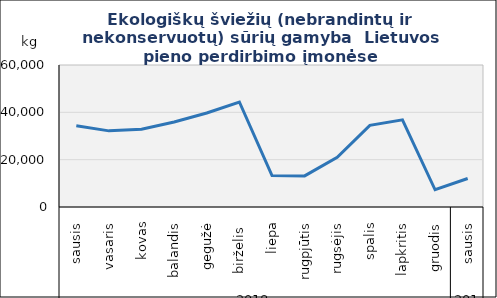
| Category | Švieži (nebrandinti ir nekonservuoti) sūriai |
|---|---|
| 0 | 34289 |
| 1 | 32172 |
| 2 | 32897 |
| 3 | 35895 |
| 4 | 39727 |
| 5 | 44362 |
| 6 | 13297 |
| 7 | 13150 |
| 8 | 21036 |
| 9 | 34481 |
| 10 | 36817 |
| 11 | 7284 |
| 12 | 12051 |